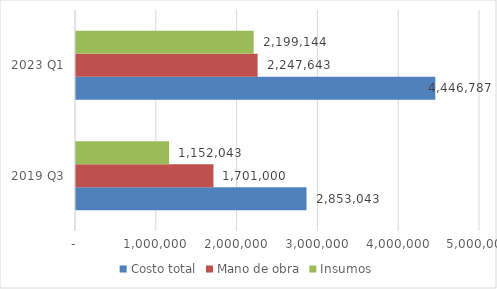
| Category | Costo total | Mano de obra | Insumos |
|---|---|---|---|
| 2019 Q3 | 2853043 | 1701000 | 1152043 |
| 2023 Q1 | 4446787 | 2247643 | 2199144 |